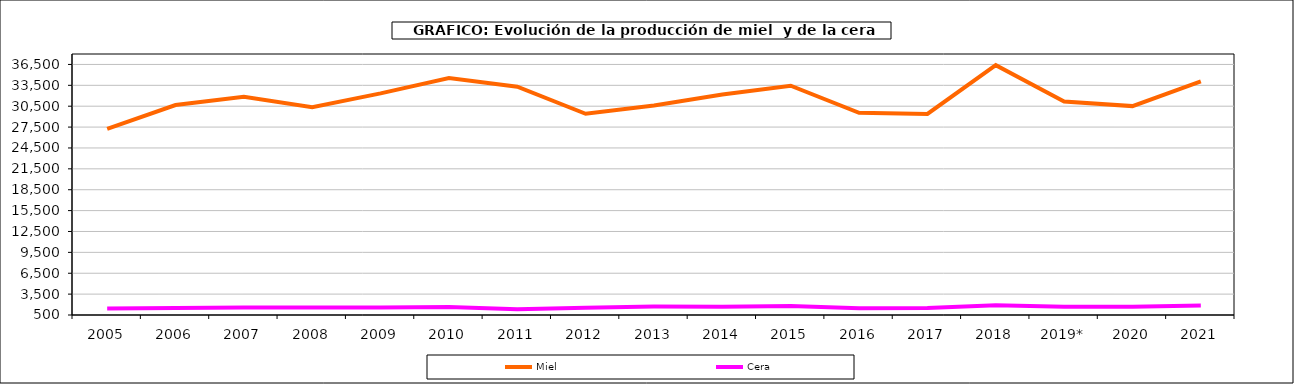
| Category | Miel | Cera |
|---|---|---|
| 2005 | 27229.804 | 1449.87 |
| 2006 | 30661.002 | 1522.368 |
| 2007 | 31840.043 | 1567.556 |
| 2008 | 30361.319 | 1574.535 |
| 2009 | 32336.448 | 1577.669 |
| 2010 | 34550 | 1649 |
| 2011 | 33298.2 | 1325.9 |
| 2012 | 29405 | 1533.9 |
| 2013 | 30612.761 | 1711.558 |
| 2014 | 32174.268 | 1688.302 |
| 2015 | 33440.771 | 1801.65 |
| 2016 | 29545.284 | 1472.699 |
| 2017 | 29393.153 | 1519.363 |
| 2018 | 36393.995 | 1903.773 |
| 2019* | 31160.769 | 1673.824 |
| 2020 | 30512.727 | 1687.065 |
| 2021 | 34064.819 | 1853.906 |